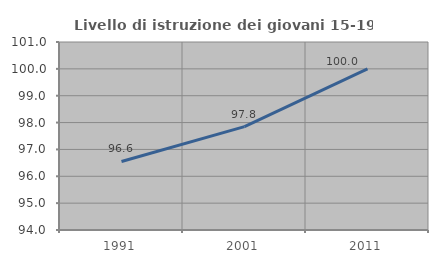
| Category | Livello di istruzione dei giovani 15-19 anni |
|---|---|
| 1991.0 | 96.552 |
| 2001.0 | 97.849 |
| 2011.0 | 100 |